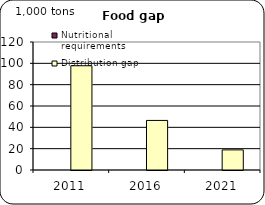
| Category | Nutritional requirements | Distribution gap |
|---|---|---|
| 2011.0 | 0 | 97.734 |
| 2016.0 | 0 | 46.476 |
| 2021.0 | 0 | 18.855 |